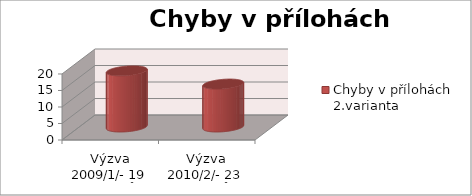
| Category | Chyby v přílohách 2.varianta |
|---|---|
| Výzva 2009/1/- 19 projektů | 17 |
| Výzva 2010/2/- 23 projektů  | 13 |